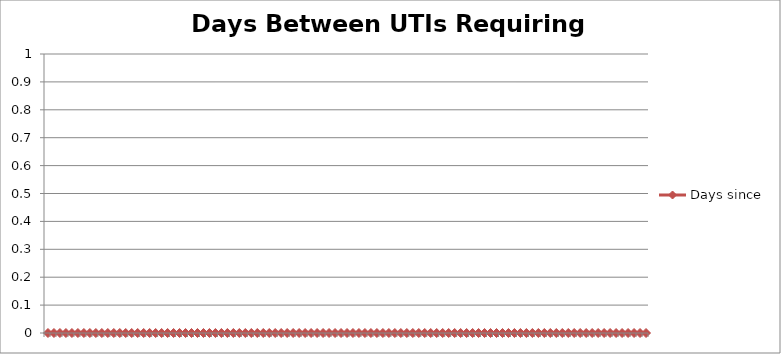
| Category | Days since |
|---|---|
|  | 0 |
|  | 0 |
|  | 0 |
|  | 0 |
|  | 0 |
|  | 0 |
|  | 0 |
|  | 0 |
|  | 0 |
|  | 0 |
|  | 0 |
|  | 0 |
|  | 0 |
|  | 0 |
|  | 0 |
|  | 0 |
|  | 0 |
|  | 0 |
|  | 0 |
|  | 0 |
|  | 0 |
|  | 0 |
|  | 0 |
|  | 0 |
|  | 0 |
|  | 0 |
|  | 0 |
|  | 0 |
|  | 0 |
|  | 0 |
|  | 0 |
|  | 0 |
|  | 0 |
|  | 0 |
|  | 0 |
|  | 0 |
|  | 0 |
|  | 0 |
|  | 0 |
|  | 0 |
|  | 0 |
|  | 0 |
|  | 0 |
|  | 0 |
|  | 0 |
|  | 0 |
|  | 0 |
|  | 0 |
|  | 0 |
|  | 0 |
|  | 0 |
|  | 0 |
|  | 0 |
|  | 0 |
|  | 0 |
|  | 0 |
|  | 0 |
|  | 0 |
|  | 0 |
|  | 0 |
|  | 0 |
|  | 0 |
|  | 0 |
|  | 0 |
|  | 0 |
|  | 0 |
|  | 0 |
|  | 0 |
|  | 0 |
|  | 0 |
|  | 0 |
|  | 0 |
|  | 0 |
|  | 0 |
|  | 0 |
|  | 0 |
|  | 0 |
|  | 0 |
|  | 0 |
|  | 0 |
|  | 0 |
|  | 0 |
|  | 0 |
|  | 0 |
|  | 0 |
|  | 0 |
|  | 0 |
|  | 0 |
|  | 0 |
|  | 0 |
|  | 0 |
|  | 0 |
|  | 0 |
|  | 0 |
|  | 0 |
|  | 0 |
|  | 0 |
|  | 0 |
|  | 0 |
|  | 0 |
|  | 0 |